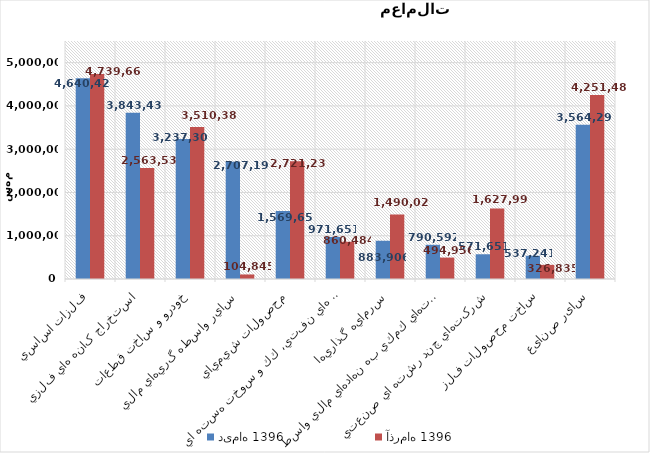
| Category | دی‌ماه 1396 | آذر‌ماه 1396 |
|---|---|---|
| فلزات اساسي | 4640420.828 | 4739665.623 |
| استخراج کانه هاي فلزي | 3843437.63 | 2563533.425 |
| خودرو و ساخت قطعات | 3237305.177 | 3510383.074 |
| ساير واسطه گريهاي مالي | 2707190.239 | 104845.239 |
| محصولات شيميايي | 1569657 | 2721239.257 |
| فراورده هاي نفتي، كك و سوخت هسته اي | 971651.026 | 860484.138 |
| سرمايه گذاريها | 883906.218 | 1490020.237 |
| فعاليتهاي كمكي به نهادهاي مالي واسط | 790592.297 | 494956.458 |
| شرکتهاي چند رشته اي صنعتي | 571651.107 | 1627995.158 |
| ساخت محصولات فلزي | 537241.123 | 326835.32 |
| سایر صنایع | 3564294.266 | 4251482.256 |